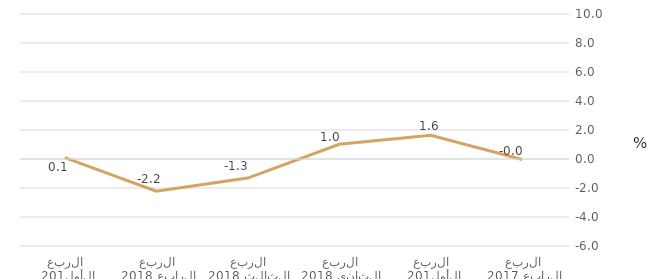
| Category | قطاع الحكومة العامة |
|---|---|
| الربع الرابع 2017 | -0.038 |
| الربع الأول 2018 | 1.635 |
| الربع الثاني 2018 | 1.016 |
| الربع الثالث 2018 | -1.315 |
| الربع الرابع 2018 | -2.226 |
| الربع الأول 2019 | 0.099 |